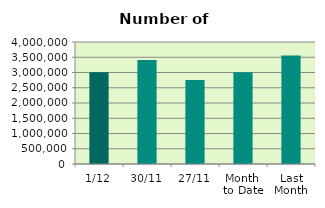
| Category | Series 0 |
|---|---|
| 1/12 | 3011614 |
| 30/11 | 3409518 |
| 27/11 | 2757098 |
| Month 
to Date | 3011614 |
| Last
Month | 3558191.714 |